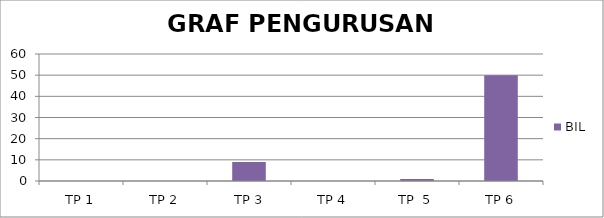
| Category | BIL |
|---|---|
| TP 1 | 0 |
| TP 2 | 0 |
|  TP 3 | 9 |
| TP 4 | 0 |
| TP  5 | 1 |
| TP 6 | 50 |